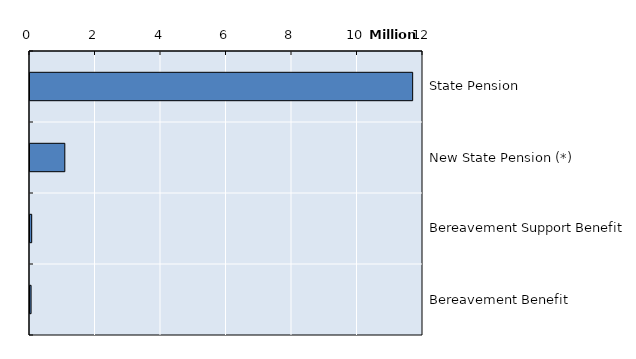
| Category | Series 0 |
|---|---|
| State Pension | 11684170 |
| New State Pension (*) | 1063093 |
| Bereavement Support Benefit | 51822 |
| Bereavement Benefit | 32763 |